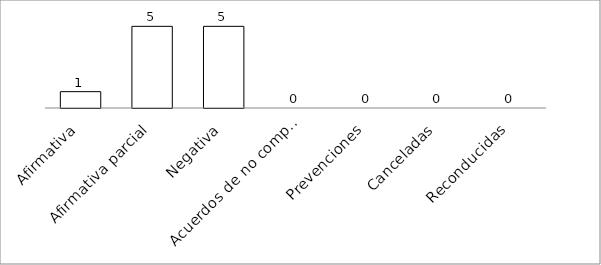
| Category | Series 0 |
|---|---|
| Afirmativa | 1 |
| Afirmativa parcial | 5 |
| Negativa | 5 |
| Acuerdos de no competencia | 0 |
| Prevenciones | 0 |
| Canceladas | 0 |
| Reconducidas | 0 |